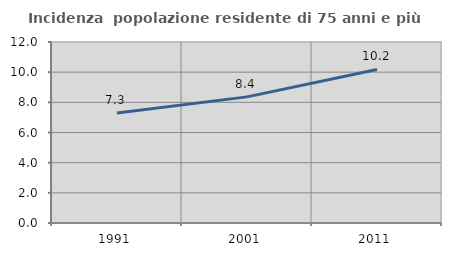
| Category | Incidenza  popolazione residente di 75 anni e più |
|---|---|
| 1991.0 | 7.3 |
| 2001.0 | 8.362 |
| 2011.0 | 10.181 |